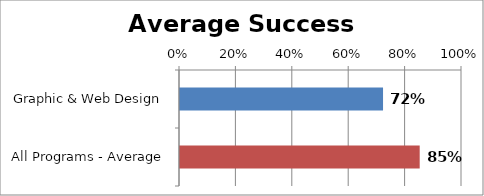
| Category | RetentionRate |
|---|---|
| Graphic & Web Design | 0.72 |
| All Programs - Average | 0.85 |